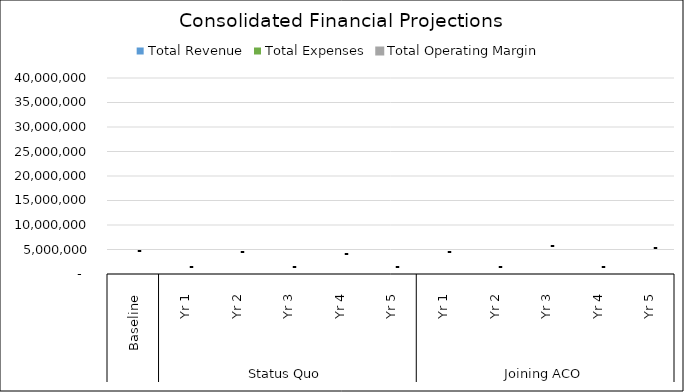
| Category |  Total Revenue  |  Total Expenses  |  Total Operating Margin  |
|---|---|---|---|
| 0 | 0 | 0 | 0 |
| 1 | 0 | 0 | 0 |
| 2 | 0 | 0 | 0 |
| 3 | 0 | 0 | 0 |
| 4 | 0 | 0 | 0 |
| 5 | 0 | 0 | 0 |
| 6 | 0 | 0 | 0 |
| 7 | 0 | 0 | 0 |
| 8 | 0 | 0 | 0 |
| 9 | 0 | 0 | 0 |
| 10 | 0 | 0 | 0 |